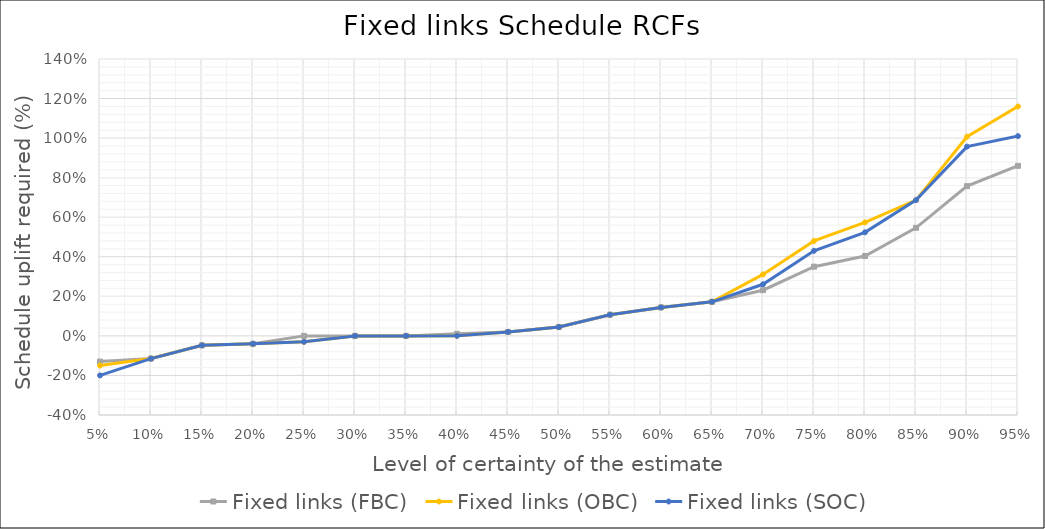
| Category | Fixed links (FBC) | Fixed links (OBC) | Fixed links (SOC) |
|---|---|---|---|
| 0.05 | -0.13 | -0.15 | -0.2 |
| 0.1 | -0.115 | -0.115 | -0.115 |
| 0.15 | -0.048 | -0.048 | -0.048 |
| 0.2 | -0.04 | -0.04 | -0.04 |
| 0.25 | 0 | -0.03 | -0.03 |
| 0.3 | 0 | 0 | 0 |
| 0.35 | 0 | 0 | 0 |
| 0.4 | 0.011 | 0.001 | 0.001 |
| 0.45 | 0.02 | 0.02 | 0.02 |
| 0.5 | 0.045 | 0.045 | 0.045 |
| 0.55 | 0.107 | 0.107 | 0.107 |
| 0.6 | 0.144 | 0.144 | 0.144 |
| 0.65 | 0.172 | 0.172 | 0.172 |
| 0.7 | 0.231 | 0.311 | 0.261 |
| 0.75 | 0.35 | 0.48 | 0.43 |
| 0.8 | 0.404 | 0.574 | 0.524 |
| 0.85 | 0.546 | 0.686 | 0.686 |
| 0.9 | 0.757 | 1.007 | 0.957 |
| 0.95 | 0.86 | 1.16 | 1.01 |